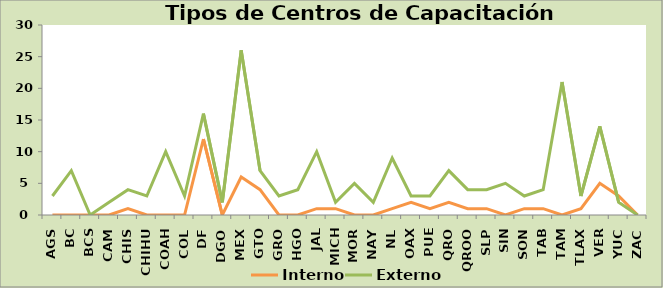
| Category | Interno | Externo |
|---|---|---|
| AGS | 0 | 3 |
| BC | 0 | 7 |
| BCS | 0 | 0 |
| CAM | 0 | 2 |
| CHIS | 1 | 4 |
| CHIHU | 0 | 3 |
| COAH | 0 | 10 |
| COL | 0 | 3 |
| DF | 12 | 16 |
| DGO | 0 | 2 |
| MEX | 6 | 26 |
| GTO | 4 | 7 |
| GRO | 0 | 3 |
| HGO | 0 | 4 |
| JAL | 1 | 10 |
| MICH | 1 | 2 |
| MOR | 0 | 5 |
| NAY | 0 | 2 |
| NL | 1 | 9 |
| OAX | 2 | 3 |
| PUE | 1 | 3 |
| QRO | 2 | 7 |
| QROO | 1 | 4 |
| SLP | 1 | 4 |
| SIN | 0 | 5 |
| SON | 1 | 3 |
| TAB | 1 | 4 |
| TAM | 0 | 21 |
| TLAX | 1 | 3 |
| VER | 5 | 14 |
| YUC | 3 | 2 |
| ZAC | 0 | 0 |